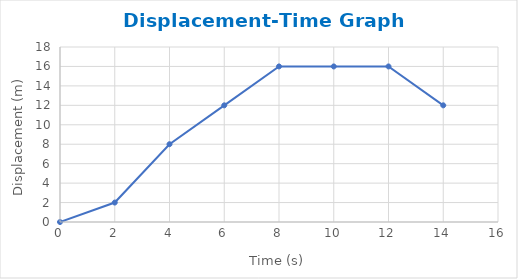
| Category | Series 0 |
|---|---|
| 0.0 | 0 |
| 2.0 | 2 |
| 4.0 | 8 |
| 6.0 | 12 |
| 8.0 | 16 |
| 10.0 | 16 |
| 12.0 | 16 |
| 14.0 | 12 |